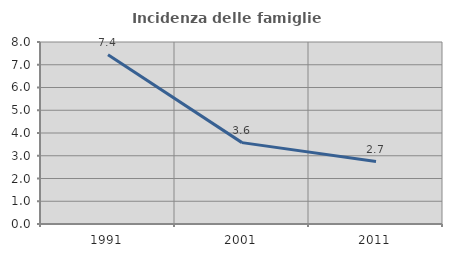
| Category | Incidenza delle famiglie numerose |
|---|---|
| 1991.0 | 7.44 |
| 2001.0 | 3.577 |
| 2011.0 | 2.744 |